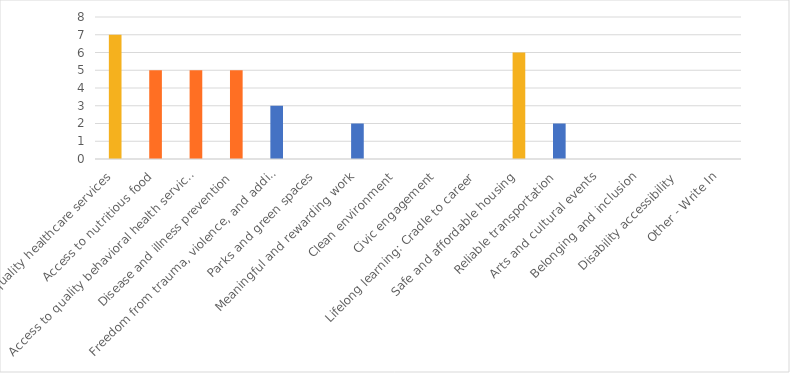
| Category | Number of Responses |
|---|---|
| Access to quality healthcare services | 7 |
| Access to nutritious food | 5 |
| Access to quality behavioral health services | 5 |
| Disease and illness prevention | 5 |
| Freedom from trauma, violence, and addiction | 3 |
| Parks and green spaces | 0 |
| Meaningful and rewarding work | 2 |
| Clean environment | 0 |
| Civic engagement | 0 |
| Lifelong learning: Cradle to career | 0 |
| Safe and affordable housing | 6 |
| Reliable transportation | 2 |
| Arts and cultural events | 0 |
| Belonging and inclusion | 0 |
| Disability accessibility | 0 |
| Other - Write In | 0 |